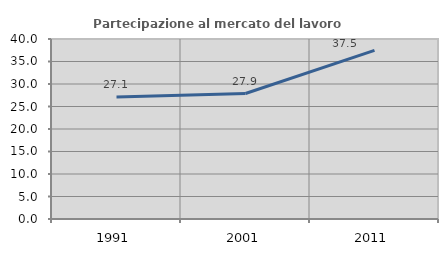
| Category | Partecipazione al mercato del lavoro  femminile |
|---|---|
| 1991.0 | 27.105 |
| 2001.0 | 27.887 |
| 2011.0 | 37.462 |